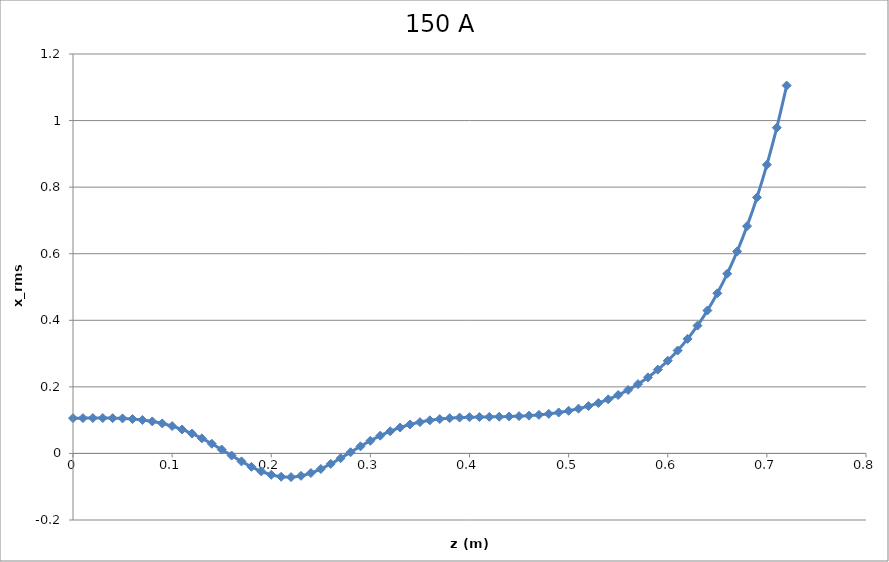
| Category | Series 0 |
|---|---|
| 0.0 | 0.106 |
| 0.01 | 0.106 |
| 0.02 | 0.106 |
| 0.03 | 0.106 |
| 0.04 | 0.106 |
| 0.05 | 0.105 |
| 0.06 | 0.103 |
| 0.07 | 0.1 |
| 0.08 | 0.096 |
| 0.09 | 0.09 |
| 0.1 | 0.082 |
| 0.11 | 0.072 |
| 0.12 | 0.06 |
| 0.13 | 0.045 |
| 0.14 | 0.029 |
| 0.15 | 0.012 |
| 0.16 | -0.006 |
| 0.17 | -0.024 |
| 0.18 | -0.04 |
| 0.19 | -0.054 |
| 0.2 | -0.064 |
| 0.21 | -0.07 |
| 0.22 | -0.071 |
| 0.23 | -0.067 |
| 0.24 | -0.059 |
| 0.25 | -0.047 |
| 0.26 | -0.031 |
| 0.27 | -0.014 |
| 0.28 | 0.004 |
| 0.29 | 0.021 |
| 0.3 | 0.038 |
| 0.31 | 0.053 |
| 0.32 | 0.067 |
| 0.33 | 0.078 |
| 0.34 | 0.087 |
| 0.35 | 0.094 |
| 0.36 | 0.099 |
| 0.37 | 0.103 |
| 0.38 | 0.106 |
| 0.39 | 0.108 |
| 0.4 | 0.109 |
| 0.41 | 0.109 |
| 0.42 | 0.11 |
| 0.43 | 0.11 |
| 0.44 | 0.111 |
| 0.45 | 0.112 |
| 0.46 | 0.114 |
| 0.47 | 0.116 |
| 0.48 | 0.119 |
| 0.49 | 0.123 |
| 0.5 | 0.128 |
| 0.51 | 0.134 |
| 0.52 | 0.142 |
| 0.53 | 0.152 |
| 0.54 | 0.163 |
| 0.55 | 0.176 |
| 0.56 | 0.191 |
| 0.57 | 0.208 |
| 0.58 | 0.228 |
| 0.59 | 0.252 |
| 0.6 | 0.279 |
| 0.61 | 0.309 |
| 0.62 | 0.344 |
| 0.63 | 0.384 |
| 0.64 | 0.429 |
| 0.65 | 0.481 |
| 0.66 | 0.54 |
| 0.67 | 0.607 |
| 0.68 | 0.683 |
| 0.69 | 0.769 |
| 0.7 | 0.867 |
| 0.71 | 0.979 |
| 0.72 | 1.105 |